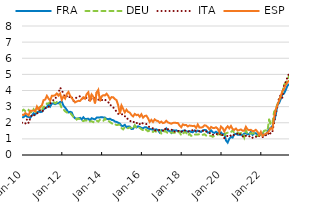
| Category | FRA | DEU | ITA | ESP |
|---|---|---|---|---|
| 2010-01-01 | 2.33 | 2.74 | 2 | 2.5 |
| 2010-02-01 | 2.35 | 2.81 | 1.93 | 2.48 |
| 2010-03-01 | 2.47 | 2.72 | 1.94 | 2.6 |
| 2010-04-01 | 2.38 | 2.69 | 2.21 | 2.53 |
| 2010-05-01 | 2.36 | 2.79 | 1.98 | 2.46 |
| 2010-06-01 | 2.31 | 2.65 | 2.28 | 2.74 |
| 2010-07-01 | 2.45 | 2.65 | 2.51 | 2.74 |
| 2010-08-01 | 2.59 | 2.84 | 2.45 | 2.76 |
| 2010-09-01 | 2.52 | 2.68 | 2.51 | 2.71 |
| 2010-10-01 | 2.63 | 2.67 | 2.54 | 3.01 |
| 2010-11-01 | 2.7 | 2.91 | 2.73 | 2.84 |
| 2010-12-01 | 2.66 | 2.99 | 2.79 | 2.98 |
| 2011-01-01 | 2.68 | 2.77 | 2.68 | 3.08 |
| 2011-02-01 | 2.83 | 3 | 2.79 | 3.4 |
| 2011-03-01 | 2.9 | 3 | 2.89 | 3.44 |
| 2011-04-01 | 2.97 | 3.19 | 2.99 | 3.67 |
| 2011-05-01 | 3.13 | 3.2 | 2.96 | 3.5 |
| 2011-06-01 | 3.01 | 3.29 | 3.18 | 3.38 |
| 2011-07-01 | 3.2 | 3.27 | 3.3 | 3.67 |
| 2011-08-01 | 3.2 | 3.29 | 3.42 | 3.67 |
| 2011-09-01 | 3.15 | 3.2 | 3.44 | 3.71 |
| 2011-10-01 | 3.2 | 3.29 | 3.73 | 3.81 |
| 2011-11-01 | 3.21 | 3.16 | 3.86 | 3.68 |
| 2011-12-01 | 3.29 | 3.17 | 4.18 | 3.81 |
| 2012-01-01 | 3.31 | 2.88 | 4.02 | 3.42 |
| 2012-02-01 | 3.06 | 2.83 | 3.79 | 3.64 |
| 2012-03-01 | 2.94 | 2.71 | 3.58 | 3.5 |
| 2012-04-01 | 2.8 | 2.64 | 3.64 | 3.78 |
| 2012-05-01 | 2.64 | 2.61 | 3.71 | 3.91 |
| 2012-06-01 | 2.68 | 2.62 | 3.52 | 3.68 |
| 2012-07-01 | 2.64 | 2.49 | 3.59 | 3.53 |
| 2012-08-01 | 2.39 | 2.36 | 3.34 | 3.4 |
| 2012-09-01 | 2.28 | 2.34 | 3.46 | 3.26 |
| 2012-10-01 | 2.25 | 2.2 | 3.59 | 3.32 |
| 2012-11-01 | 2.27 | 2.27 | 3.63 | 3.36 |
| 2012-12-01 | 2.3 | 2.19 | 3.64 | 3.35 |
| 2013-01-01 | 2.21 | 2.14 | 3.6 | 3.48 |
| 2013-02-01 | 2.34 | 2.1 | 3.47 | 3.58 |
| 2013-03-01 | 2.22 | 2.15 | 3.49 | 3.49 |
| 2013-04-01 | 2.24 | 2.13 | 3.56 | 3.78 |
| 2013-05-01 | 2.25 | 2.04 | 3.46 | 3.89 |
| 2013-06-01 | 2.15 | 2.08 | 3.34 | 3.33 |
| 2013-07-01 | 2.28 | 2.09 | 3.51 | 3.75 |
| 2013-08-01 | 2.24 | 2.04 | 3.48 | 3.61 |
| 2013-09-01 | 2.21 | 2.14 | 3.54 | 3.2 |
| 2013-10-01 | 2.32 | 2.13 | 3.49 | 3.88 |
| 2013-11-01 | 2.33 | 2.07 | 3.43 | 4.04 |
| 2013-12-01 | 2.33 | 2.19 | 3.45 | 3.34 |
| 2014-01-01 | 2.35 | 2.14 | 3.39 | 3.64 |
| 2014-02-01 | 2.33 | 2.11 | 3.47 | 3.71 |
| 2014-03-01 | 2.32 | 2.26 | 3.44 | 3.69 |
| 2014-04-01 | 2.24 | 2.12 | 3.33 | 3.8 |
| 2014-05-01 | 2.22 | 2.13 | 3.29 | 3.67 |
| 2014-06-01 | 2.25 | 2.04 | 3.08 | 3.45 |
| 2014-07-01 | 2.18 | 1.98 | 3.09 | 3.59 |
| 2014-08-01 | 2.16 | 1.89 | 2.95 | 3.58 |
| 2014-09-01 | 2.08 | 1.91 | 2.87 | 3.47 |
| 2014-10-01 | 2.05 | 1.86 | 2.66 | 3.4 |
| 2014-11-01 | 2 | 1.87 | 2.55 | 3.09 |
| 2014-12-01 | 1.95 | 1.87 | 2.57 | 2.57 |
| 2015-01-01 | 1.81 | 1.67 | 2.52 | 3.07 |
| 2015-02-01 | 1.8 | 1.59 | 2.54 | 2.86 |
| 2015-03-01 | 1.87 | 1.73 | 2.4 | 2.64 |
| 2015-04-01 | 1.72 | 1.68 | 2.39 | 2.81 |
| 2015-05-01 | 1.77 | 1.66 | 2.17 | 2.67 |
| 2015-06-01 | 1.76 | 1.71 | 2.13 | 2.63 |
| 2015-07-01 | 1.61 | 1.68 | 2.06 | 2.48 |
| 2015-08-01 | 1.63 | 1.62 | 2.1 | 2.39 |
| 2015-09-01 | 1.83 | 1.84 | 1.97 | 2.55 |
| 2015-10-01 | 1.71 | 1.68 | 2.01 | 2.47 |
| 2015-11-01 | 1.78 | 1.67 | 1.87 | 2.5 |
| 2015-12-01 | 1.74 | 1.68 | 1.92 | 2.37 |
| 2016-01-01 | 1.68 | 1.6 | 2.03 | 2.53 |
| 2016-02-01 | 1.66 | 1.54 | 1.94 | 2.32 |
| 2016-03-01 | 1.72 | 1.64 | 1.9 | 2.42 |
| 2016-04-01 | 1.72 | 1.55 | 1.92 | 2.44 |
| 2016-05-01 | 1.64 | 1.47 | 1.78 | 2.28 |
| 2016-06-01 | 1.61 | 1.52 | 1.73 | 2.05 |
| 2016-07-01 | 1.6 | 1.46 | 1.71 | 2.18 |
| 2016-08-01 | 1.56 | 1.43 | 1.65 | 2.05 |
| 2016-09-01 | 1.58 | 1.51 | 1.5 | 2.21 |
| 2016-10-01 | 1.59 | 1.43 | 1.57 | 2.13 |
| 2016-11-01 | 1.54 | 1.45 | 1.56 | 2.11 |
| 2016-12-01 | 1.4 | 1.53 | 1.54 | 2 |
| 2017-01-01 | 1.54 | 1.33 | 1.56 | 2.07 |
| 2017-02-01 | 1.5 | 1.33 | 1.52 | 1.98 |
| 2017-03-01 | 1.52 | 1.5 | 1.67 | 2.01 |
| 2017-04-01 | 1.65 | 1.43 | 1.52 | 2.12 |
| 2017-05-01 | 1.51 | 1.35 | 1.6 | 2.02 |
| 2017-06-01 | 1.5 | 1.41 | 1.54 | 1.98 |
| 2017-07-01 | 1.38 | 1.39 | 1.55 | 1.94 |
| 2017-08-01 | 1.54 | 1.38 | 1.59 | 1.99 |
| 2017-09-01 | 1.51 | 1.38 | 1.45 | 2 |
| 2017-10-01 | 1.53 | 1.35 | 1.5 | 1.99 |
| 2017-11-01 | 1.48 | 1.4 | 1.49 | 1.98 |
| 2017-12-01 | 1.48 | 1.43 | 1.5 | 1.83 |
| 2018-01-01 | 1.43 | 1.22 | 1.42 | 1.72 |
| 2018-02-01 | 1.5 | 1.32 | 1.54 | 1.9 |
| 2018-03-01 | 1.52 | 1.42 | 1.54 | 1.85 |
| 2018-04-01 | 1.48 | 1.39 | 1.47 | 1.86 |
| 2018-05-01 | 1.44 | 1.2 | 1.44 | 1.77 |
| 2018-06-01 | 1.49 | 1.31 | 1.49 | 1.83 |
| 2018-07-01 | 1.43 | 1.19 | 1.49 | 1.81 |
| 2018-08-01 | 1.41 | 1.18 | 1.55 | 1.8 |
| 2018-09-01 | 1.52 | 1.26 | 1.46 | 1.81 |
| 2018-10-01 | 1.44 | 1.28 | 1.53 | 1.68 |
| 2018-11-01 | 1.51 | 1.27 | 1.51 | 1.89 |
| 2018-12-01 | 1.47 | 1.29 | 1.47 | 1.7 |
| 2019-01-01 | 1.43 | 1.24 | 1.47 | 1.7 |
| 2019-02-01 | 1.52 | 1.25 | 1.52 | 1.73 |
| 2019-03-01 | 1.55 | 1.29 | 1.42 | 1.84 |
| 2019-04-01 | 1.54 | 1.21 | 1.46 | 1.82 |
| 2019-05-01 | 1.39 | 1.19 | 1.43 | 1.73 |
| 2019-06-01 | 1.41 | 1.18 | 1.35 | 1.59 |
| 2019-07-01 | 1.53 | 1.19 | 1.37 | 1.74 |
| 2019-08-01 | 1.41 | 1.13 | 1.26 | 1.68 |
| 2019-09-01 | 1.37 | 1.18 | 1.26 | 1.67 |
| 2019-10-01 | 1.44 | 1.22 | 1.31 | 1.72 |
| 2019-11-01 | 1.37 | 1.27 | 1.29 | 1.63 |
| 2019-12-01 | 1.36 | 1.29 | 1.37 | 1.43 |
| 2020-01-01 | 1.4 | 1.24 | 1.18 | 1.77 |
| 2020-02-01 | 1.27 | 1.19 | 1.25 | 1.67 |
| 2020-03-01 | 1.31 | 1.2 | 1.05 | 1.46 |
| 2020-04-01 | 0.9 | 1.35 | 1.06 | 1.66 |
| 2020-05-01 | 0.77 | 1.38 | 1.21 | 1.78 |
| 2020-06-01 | 1.01 | 1.36 | 1.26 | 1.65 |
| 2020-07-01 | 1.12 | 1.43 | 1.19 | 1.8 |
| 2020-08-01 | 1.08 | 1.52 | 1.15 | 1.61 |
| 2020-09-01 | 1.28 | 1.37 | 1.29 | 1.56 |
| 2020-10-01 | 1.31 | 1.37 | 1.29 | 1.64 |
| 2020-11-01 | 1.26 | 1.39 | 1.33 | 1.52 |
| 2020-12-01 | 1.25 | 1.33 | 1.38 | 1.54 |
| 2021-01-01 | 1.25 | 1.36 | 1.17 | 1.59 |
| 2021-02-01 | 1.24 | 1.37 | 1.14 | 1.5 |
| 2021-03-01 | 1.33 | 1.09 | 1.25 | 1.51 |
| 2021-04-01 | 1.36 | 1.52 | 1.19 | 1.75 |
| 2021-05-01 | 1.28 | 1.32 | 1.13 | 1.58 |
| 2021-06-01 | 1.28 | 1.28 | 1.17 | 1.54 |
| 2021-07-01 | 1.43 | 1.35 | 1.05 | 1.56 |
| 2021-08-01 | 1.25 | 1.33 | 1.07 | 1.48 |
| 2021-09-01 | 1.35 | 1.36 | 1.16 | 1.49 |
| 2021-10-01 | 1.35 | 1.21 | 1.14 | 1.56 |
| 2021-11-01 | 1.26 | 1.18 | 1.09 | 1.44 |
| 2021-12-01 | 1.28 | 1.2 | 1.18 | 1.24 |
| 2022-01-01 | 1.27 | 1.29 | 1.12 | 1.44 |
| 2022-02-01 | 1.34 | 1.32 | 1.09 | 1.19 |
| 2022-03-01 | 1.23 | 1.5 | 1.23 | 1.26 |
| 2022-04-01 | 1.25 | 1.53 | 1.23 | 1.32 |
| 2022-05-01 | 1.42 | 1.49 | 1.19 | 1.37 |
| 2022-06-01 | 1.62 | 2.19 | 1.44 | 1.49 |
| 2022-07-01 | 1.68 | 1.89 | 1.31 | 1.67 |
| 2022-08-01 | 1.79 | 1.97 | 1.45 | 1.6 |
| 2022-09-01 | 2.11 | 2.67 | 1.99 | 2.31 |
| 2022-10-01 | 2.49 | 2.86 | 2.54 | 2.82 |
| 2022-11-01 | 3.1 | 3.14 | 3 | 3.09 |
| 2022-12-01 | 3.21 | 3.45 | 3.55 | 3.37 |
| 2023-01-01 | 3.47 | 3.59 | 3.72 | 3.64 |
| 2023-02-01 | 3.75 | 3.88 | 3.55 | 3.96 |
| 2023-03-01 | 3.81 | 4.36 | 4.3 | 4.1 |
| 2023-04-01 | 4.03 | 4.45 | 4.52 | 4.35 |
| 2023-05-01 | 4.28 | 4.65 | 4.81 | 4.49 |
| 2023-06-01 | 4.41 | 4.89 | 5.04 | 4.63 |